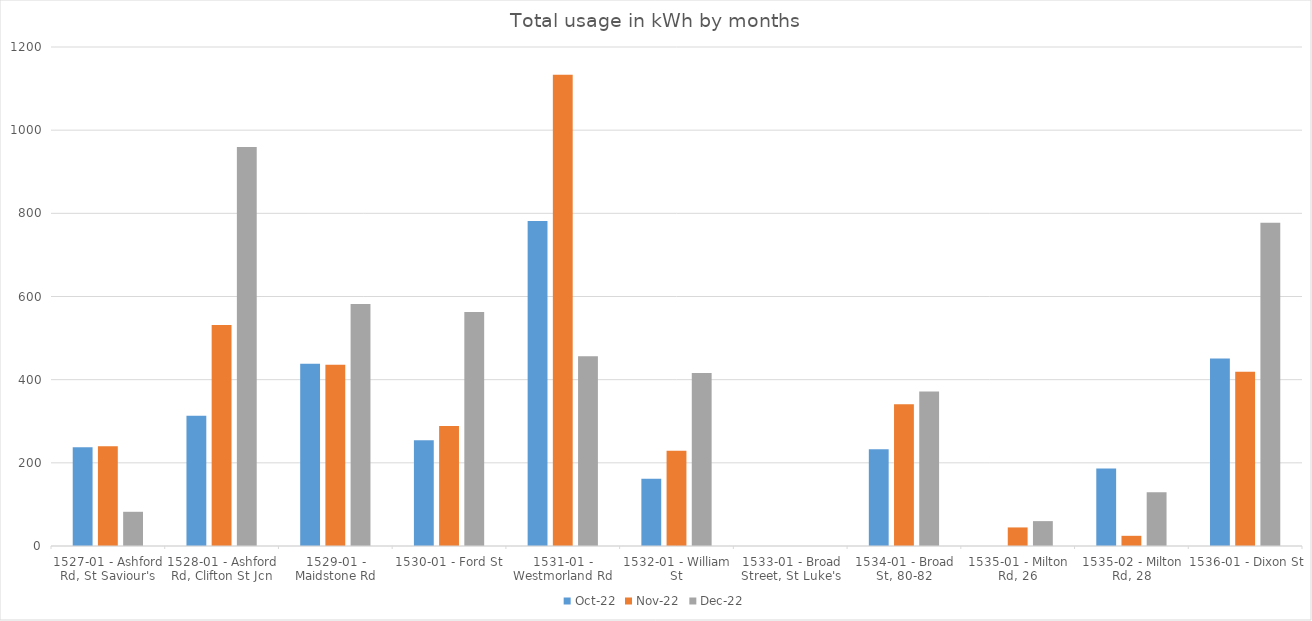
| Category | Oct-22 | Nov-22 | Dec-22 |
|---|---|---|---|
| 1527-01 - Ashford Rd, St Saviour's | 237.76 | 240.09 | 82.26 |
| 1528-01 - Ashford Rd, Clifton St Jcn | 313.26 | 531.57 | 959.23 |
| 1529-01 - Maidstone Rd | 438.18 | 435.8 | 581.92 |
| 1530-01 - Ford St | 254.21 | 288.51 | 562.47 |
| 1531-01 - Westmorland Rd | 781.34 | 1133.56 | 456.58 |
| 1532-01 - William St | 161.6 | 229.19 | 416.18 |
| 1533-01 - Broad Street, St Luke's | 0 | 0 | 0 |
| 1534-01 - Broad St, 80-82 | 232.72 | 340.72 | 371.81 |
| 1535-01 - Milton Rd, 26 | 0 | 44.64 | 59.81 |
| 1535-02 - Milton Rd, 28 | 186.65 | 24.49 | 129.19 |
| 1536-01 - Dixon St | 450.67 | 418.84 | 777.17 |